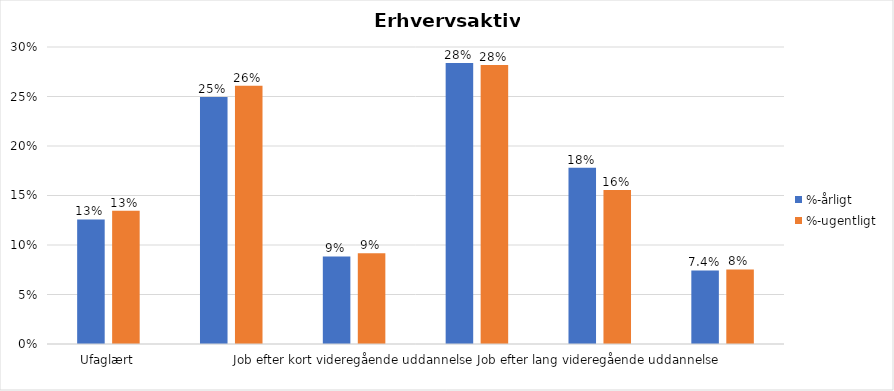
| Category | %-årligt | %-ugentligt |
|---|---|---|
| Ufaglært | 0.126 | 0.135 |
| Erhvervsfagligt job | 0.249 | 0.261 |
| Job efter kort videregående uddannelse | 0.088 | 0.092 |
| Job efter mellemlang videregående uddannelse | 0.284 | 0.282 |
| Job efter lang videregående uddannelse | 0.178 | 0.156 |
| Selvstændig | 0.074 | 0.075 |